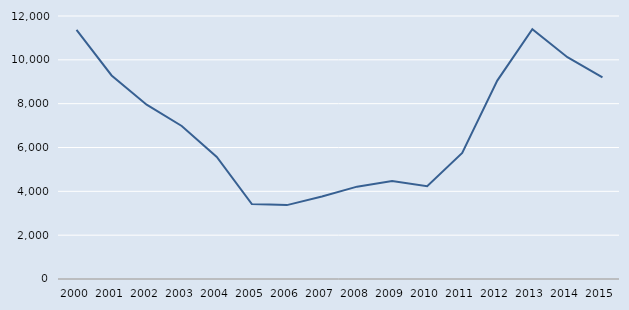
| Category | Series 0 |
|---|---|
| 2000.0 | 11369 |
| 2001.0 | 9287 |
| 2002.0 | 7955 |
| 2003.0 | 6981 |
| 2004.0 | 5570 |
| 2005.0 | 3418 |
| 2006.0 | 3371 |
| 2007.0 | 3766 |
| 2008.0 | 4214 |
| 2009.0 | 4468 |
| 2010.0 | 4238 |
| 2011.0 | 5752 |
| 2012.0 | 9054 |
| 2013.0 | 11401 |
| 2014.0 | 10121 |
| 2015.0 | 9195 |